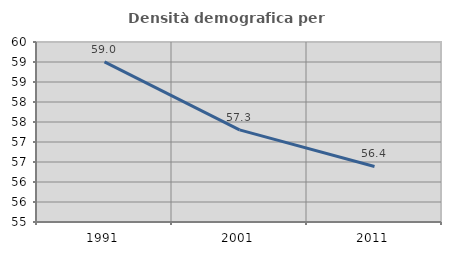
| Category | Densità demografica |
|---|---|
| 1991.0 | 59.002 |
| 2001.0 | 57.303 |
| 2011.0 | 56.388 |